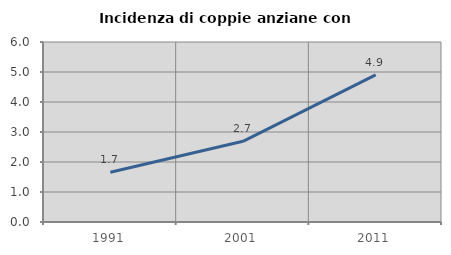
| Category | Incidenza di coppie anziane con figli |
|---|---|
| 1991.0 | 1.658 |
| 2001.0 | 2.69 |
| 2011.0 | 4.904 |